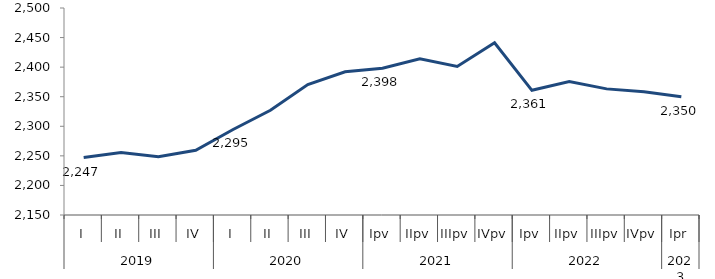
| Category | Series 0 |
|---|---|
| 0 | 2247.095 |
| 1 | 2255.594 |
| 2 | 2248.39 |
| 3 | 2259.472 |
| 4 | 2294.598 |
| 5 | 2327.144 |
| 6 | 2370.6 |
| 7 | 2392.098 |
| 8 | 2398.201 |
| 9 | 2413.932 |
| 10 | 2401.222 |
| 11 | 2441.157 |
| 12 | 2360.788 |
| 13 | 2375.82 |
| 14 | 2363.248 |
| 15 | 2358.48 |
| 16 | 2350 |